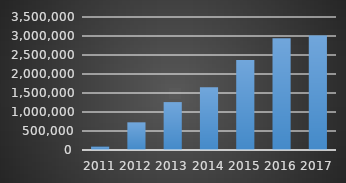
| Category | Annual Page View |
|---|---|
| 2011.0 | 90765 |
| 2012.0 | 728268 |
| 2013.0 | 1260673 |
| 2014.0 | 1652638 |
| 2015.0 | 2370672 |
| 2016.0 | 2942054 |
| 2017.0 | 3011009 |